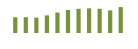
| Category | Saldo [ (1)-(2) ] |
|---|---|
| 0 | 203117.024 |
| 1 | 204244.864 |
| 2 | 198400.412 |
| 3 | 227324.117 |
| 4 | 264760.339 |
| 5 | 296455.186 |
| 6 | 312171.555 |
| 7 | 318321.614 |
| 8 | 312463.312 |
| 9 | 291611.714 |
| 10 | 334883.784 |